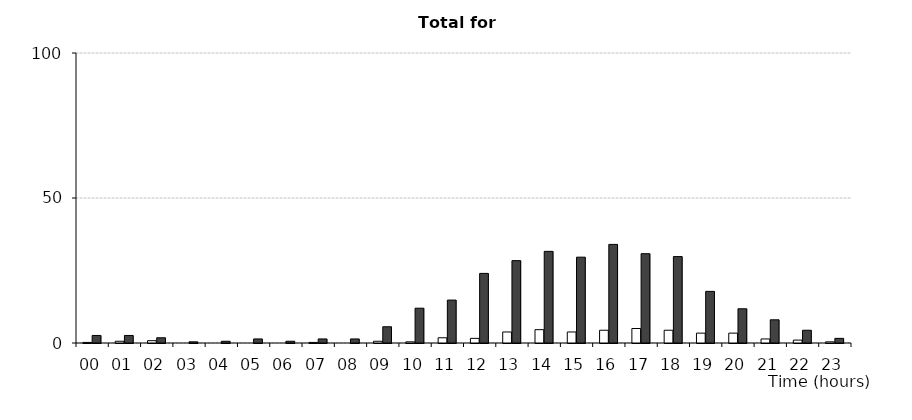
| Category | Series 1 | Series 2 |
|---|---|---|
| 00 | 0.2 | 2.6 |
| 01 | 0.6 | 2.6 |
| 02 | 0.8 | 1.8 |
| 03 | 0 | 0.4 |
| 04 | 0 | 0.6 |
| 05 | 0 | 1.4 |
| 06 | 0 | 0.6 |
| 07 | 0.2 | 1.4 |
| 08 | 0 | 1.4 |
| 09 | 0.6 | 5.6 |
| 10 | 0.4 | 12 |
| 11 | 1.8 | 14.8 |
| 12 | 1.6 | 24 |
| 13 | 3.8 | 28.4 |
| 14 | 4.6 | 31.6 |
| 15 | 3.8 | 29.6 |
| 16 | 4.4 | 34 |
| 17 | 5 | 30.8 |
| 18 | 4.4 | 29.8 |
| 19 | 3.4 | 17.8 |
| 20 | 3.4 | 11.8 |
| 21 | 1.4 | 8 |
| 22 | 1 | 4.4 |
| 23 | 0.4 | 1.6 |